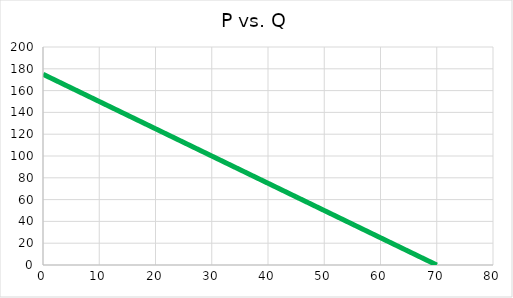
| Category | Series 0 |
|---|---|
| 0.0 | 175 |
| 1.0 | 172.5 |
| 2.0 | 170 |
| 3.0 | 167.5 |
| 4.0 | 165 |
| 5.0 | 162.5 |
| 6.0 | 160 |
| 7.0 | 157.5 |
| 8.0 | 155 |
| 9.0 | 152.5 |
| 10.0 | 150 |
| 11.0 | 147.5 |
| 12.0 | 145 |
| 13.0 | 142.5 |
| 14.0 | 140 |
| 15.0 | 137.5 |
| 16.0 | 135 |
| 17.0 | 132.5 |
| 18.0 | 130 |
| 19.0 | 127.5 |
| 20.0 | 125 |
| 21.0 | 122.5 |
| 22.0 | 120 |
| 23.0 | 117.5 |
| 24.0 | 115 |
| 25.0 | 112.5 |
| 26.0 | 110 |
| 27.0 | 107.5 |
| 28.0 | 105 |
| 29.0 | 102.5 |
| 30.0 | 100 |
| 31.0 | 97.5 |
| 32.0 | 95 |
| 33.0 | 92.5 |
| 34.0 | 90 |
| 35.0 | 87.5 |
| 36.0 | 85 |
| 37.0 | 82.5 |
| 38.0 | 80 |
| 39.0 | 77.5 |
| 40.0 | 75 |
| 41.0 | 72.5 |
| 42.0 | 70 |
| 43.0 | 67.5 |
| 44.0 | 65 |
| 45.0 | 62.5 |
| 46.0 | 60 |
| 47.0 | 57.5 |
| 48.0 | 55 |
| 49.0 | 52.5 |
| 50.0 | 50 |
| 51.0 | 47.5 |
| 52.0 | 45 |
| 53.0 | 42.5 |
| 54.0 | 40 |
| 55.0 | 37.5 |
| 56.0 | 35 |
| 57.0 | 32.5 |
| 58.0 | 30 |
| 59.0 | 27.5 |
| 60.0 | 25 |
| 61.0 | 22.5 |
| 62.0 | 20 |
| 63.0 | 17.5 |
| 64.0 | 15 |
| 65.0 | 12.5 |
| 66.0 | 10 |
| 67.0 | 7.5 |
| 68.0 | 5 |
| 69.0 | 2.5 |
| 70.0 | 0 |